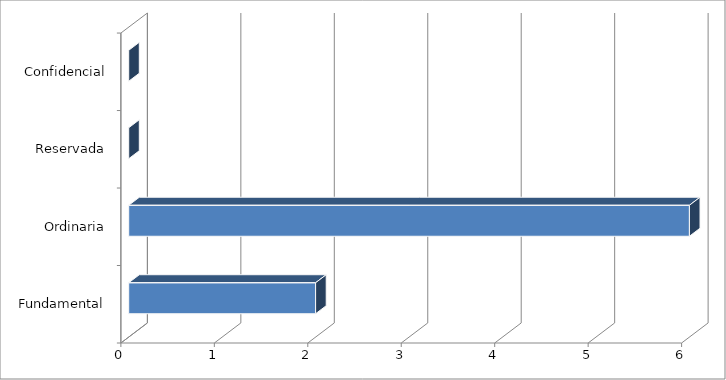
| Category | Series 0 |
|---|---|
| 0 | 2 |
| 1 | 6 |
| 2 | 0 |
| 3 | 0 |